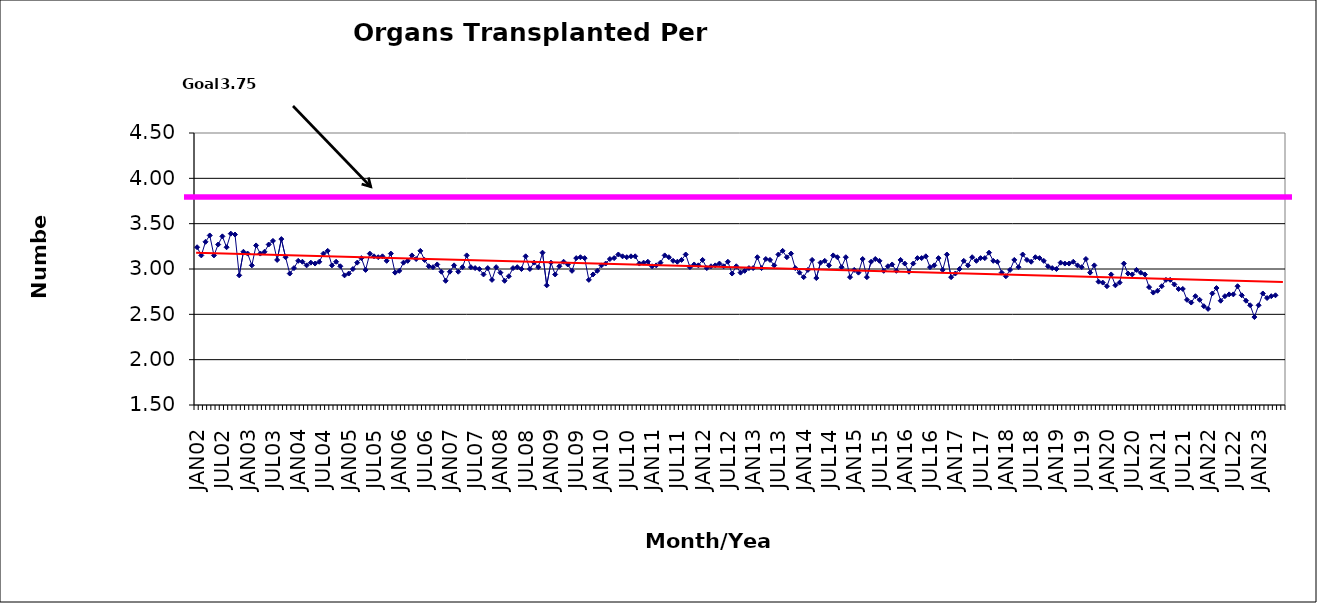
| Category | Series 0 |
|---|---|
| JAN02 | 3.24 |
| FEB02 | 3.15 |
| MAR02 | 3.3 |
| APR02 | 3.37 |
| MAY02 | 3.15 |
| JUN02 | 3.27 |
| JUL02 | 3.36 |
| AUG02 | 3.24 |
| SEP02 | 3.39 |
| OCT02 | 3.38 |
| NOV02 | 2.93 |
| DEC02 | 3.19 |
| JAN03 | 3.17 |
| FEB03 | 3.04 |
| MAR03 | 3.26 |
| APR03 | 3.17 |
| MAY03 | 3.19 |
| JUN03 | 3.27 |
| JUL03 | 3.31 |
| AUG03 | 3.1 |
| SEP03 | 3.33 |
| OCT03 | 3.13 |
| NOV03 | 2.95 |
| DEC03 | 3.01 |
| JAN04 | 3.09 |
| FEB04 | 3.08 |
| MAR04 | 3.04 |
| APR04 | 3.07 |
| MAY04 | 3.06 |
| JUN04 | 3.08 |
| JUL04 | 3.17 |
| AUG04 | 3.2 |
| SEP04 | 3.04 |
| OCT04 | 3.08 |
| NOV04 | 3.03 |
| DEC04 | 2.93 |
| JAN05 | 2.95 |
| FEB05 | 3 |
| MAR05 | 3.07 |
| APR05 | 3.12 |
| MAY05 | 2.99 |
| JUN05 | 3.17 |
| JUL05 | 3.14 |
| AUG05 | 3.13 |
| SEP05 | 3.14 |
| OCT05 | 3.09 |
| NOV05 | 3.17 |
| DEC05 | 2.96 |
| JAN06 | 2.98 |
| FEB06 | 3.07 |
| MAR06 | 3.09 |
| APR06 | 3.15 |
| MAY06 | 3.11 |
| JUN06 | 3.2 |
| JUL06 | 3.1 |
| AUG06 | 3.03 |
| SEP06 | 3.02 |
| OCT06 | 3.05 |
| NOV06 | 2.97 |
| DEC06 | 2.87 |
| JAN07 | 2.97 |
| FEB07 | 3.04 |
| MAR07 | 2.97 |
| APR07 | 3.02 |
| MAY07 | 3.15 |
| JUN07 | 3.02 |
| JUL07 | 3.01 |
| AUG07 | 3 |
| SEP07 | 2.94 |
| OCT07 | 3.01 |
| NOV07 | 2.88 |
| DEC07 | 3.02 |
| JAN08 | 2.96 |
| FEB08 | 2.87 |
| MAR08 | 2.92 |
| APR08 | 3.01 |
| MAY08 | 3.02 |
| JUN08 | 3 |
| JUL08 | 3.14 |
| AUG08 | 3 |
| SEP08 | 3.07 |
| OCT08 | 3.02 |
| NOV08 | 3.18 |
| DEC08 | 2.82 |
| JAN09 | 3.07 |
| FEB09 | 2.94 |
| MAR09 | 3.03 |
| APR09 | 3.08 |
| MAY09 | 3.05 |
| JUN09 | 2.98 |
| JUL09 | 3.12 |
| AUG09 | 3.13 |
| SEP09 | 3.12 |
| OCT09 | 2.88 |
| NOV09 | 2.94 |
| DEC09 | 2.98 |
| JAN10 | 3.04 |
| FEB10 | 3.06 |
| MAR10 | 3.11 |
| APR10 | 3.12 |
| MAY10 | 3.16 |
| JUN10 | 3.14 |
| JUL10 | 3.13 |
| AUG10 | 3.14 |
| SEP10 | 3.14 |
| OCT10 | 3.06 |
| NOV10 | 3.07 |
| DEC10 | 3.08 |
| JAN11 | 3.03 |
| FEB11 | 3.04 |
| MAR11 | 3.07 |
| APR11 | 3.15 |
| MAY11 | 3.13 |
| JUN11 | 3.09 |
| JUL11 | 3.08 |
| AUG11 | 3.1 |
| SEP11 | 3.16 |
| OCT11 | 3.02 |
| NOV11 | 3.05 |
| DEC11 | 3.04 |
| JAN12 | 3.1 |
| FEB12 | 3.01 |
| MAR12 | 3.03 |
| APR12 | 3.04 |
| MAY12 | 3.06 |
| JUN12 | 3.03 |
| JUL12 | 3.08 |
| AUG12 | 2.95 |
| SEP12 | 3.03 |
| OCT12 | 2.96 |
| NOV12 | 2.98 |
| DEC12 | 3.01 |
| JAN13 | 3.01 |
| FEB13 | 3.13 |
| MAR13 | 3.01 |
| APR13 | 3.11 |
| MAY13 | 3.1 |
| JUN13 | 3.04 |
| JUL13 | 3.16 |
| AUG13 | 3.2 |
| SEP13 | 3.13 |
| OCT13 | 3.17 |
| NOV13 | 3.01 |
| DEC13 | 2.96 |
| JAN14 | 2.91 |
| FEB14 | 2.99 |
| MAR14 | 3.1 |
| APR14 | 2.9 |
| MAY14 | 3.07 |
| JUN14 | 3.09 |
| JUL14 | 3.04 |
| AUG14 | 3.15 |
| SEP14 | 3.13 |
| OCT14 | 3.02 |
| NOV14 | 3.13 |
| DEC14 | 2.91 |
| JAN15 | 2.99 |
| FEB15 | 2.96 |
| MAR15 | 3.11 |
| APR15 | 2.91 |
| MAY15 | 3.08 |
| JUN15 | 3.11 |
| JUL15 | 3.09 |
| AUG15 | 2.98 |
| SEP15 | 3.03 |
| OCT15 | 3.05 |
| NOV15 | 2.98 |
| DEC15 | 3.1 |
| JAN16 | 3.06 |
| FEB16 | 2.97 |
| MAR16 | 3.06 |
| APR16 | 3.12 |
| MAY16 | 3.12 |
| JUN16 | 3.14 |
| JUL16 | 3.02 |
| AUG16 | 3.04 |
| SEP16 | 3.12 |
| OCT16 | 2.99 |
| NOV16 | 3.16 |
| DEC16 | 2.91 |
| JAN17 | 2.95 |
| FEB17 | 3 |
| MAR17 | 3.09 |
| APR17 | 3.04 |
| MAY17 | 3.13 |
| JUN17 | 3.09 |
| JUL17 | 3.12 |
| AUG17 | 3.12 |
| SEP17 | 3.18 |
| OCT17 | 3.09 |
| NOV17 | 3.08 |
| DEC17 | 2.96 |
| JAN18 | 2.92 |
| FEB18 | 2.99 |
| MAR18 | 3.1 |
| APR18 | 3.02 |
| MAY18 | 3.16 |
| JUN18 | 3.1 |
| JUL18 | 3.08 |
| AUG18 | 3.13 |
| SEP18 | 3.12 |
| OCT18 | 3.09 |
| NOV18 | 3.03 |
| DEC18 | 3.01 |
| JAN19 | 3 |
| FEB19 | 3.07 |
| MAR19 | 3.06 |
| APR19 | 3.06 |
| MAY19 | 3.08 |
| JUN19 | 3.04 |
| JUL19 | 3.02 |
| AUG19 | 3.11 |
| SEP19 | 2.96 |
| OCT19 | 3.04 |
| NOV19 | 2.86 |
| DEC19 | 2.85 |
| JAN20 | 2.81 |
| FEB20 | 2.94 |
| MAR20 | 2.82 |
| APR20 | 2.85 |
| MAY20 | 3.06 |
| JUN20 | 2.95 |
| JUL20 | 2.94 |
| AUG20 | 2.99 |
| SEP20 | 2.96 |
| OCT20 | 2.94 |
| NOV20 | 2.8 |
| DEC20 | 2.74 |
| JAN21 | 2.76 |
| FEB21 | 2.81 |
| MAR21 | 2.88 |
| APR21 | 2.88 |
| MAY21 | 2.83 |
| JUN21 | 2.78 |
| JUL21 | 2.78 |
| AUG21 | 2.66 |
| SEP21 | 2.63 |
| OCT21 | 2.7 |
| NOV21 | 2.66 |
| DEC21 | 2.59 |
| JAN22 | 2.56 |
| FEB22 | 2.73 |
| MAR22 | 2.79 |
| APR22 | 2.65 |
| MAY22 | 2.7 |
| JUN22 | 2.72 |
| JUL22 | 2.72 |
| AUG22 | 2.81 |
| SEP22 | 2.71 |
| OCT22 | 2.65 |
| NOV22 | 2.6 |
| DEC22 | 2.47 |
| JAN23 | 2.6 |
| FEB23 | 2.73 |
| MAR23 | 2.68 |
| APR23 | 2.7 |
| MAY23 | 2.71 |